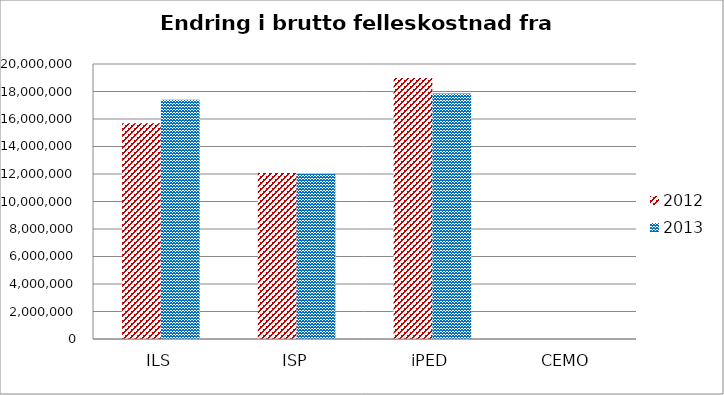
| Category | 2012 | 2013 |
|---|---|---|
| ILS | 15683150 | 17406557.05 |
| ISP | 12065111 | 12000638.541 |
| iPED | 18979469 | 17850793.409 |
| CEMO | 0 | 0 |